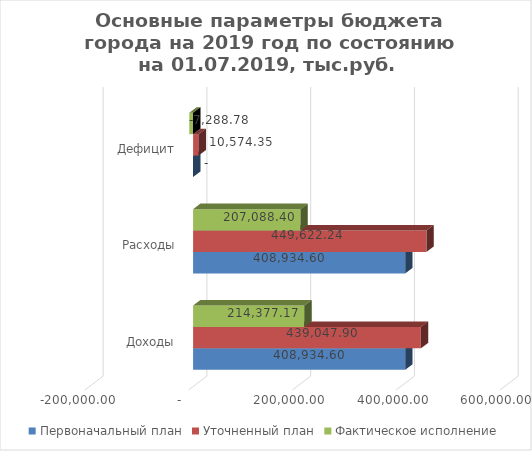
| Category | Первоначальный план | Уточненный план | Фактическое исполнение |
|---|---|---|---|
| Доходы | 408934.598 | 439047.896 | 214377.173 |
| Расходы | 408934.598 | 449622.244 | 207088.397 |
| Дефицит | 0 | 10574.348 | -7288.776 |